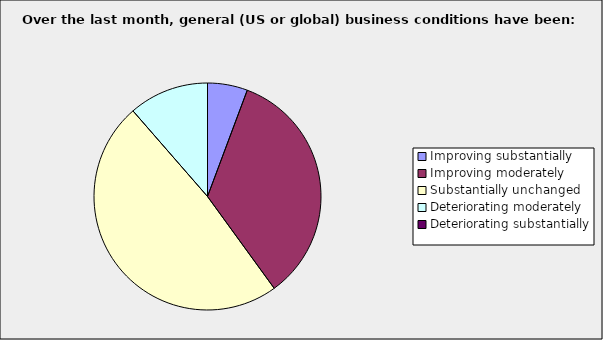
| Category | Series 0 |
|---|---|
| Improving substantially | 0.057 |
| Improving moderately | 0.343 |
| Substantially unchanged | 0.486 |
| Deteriorating moderately | 0.114 |
| Deteriorating substantially | 0 |